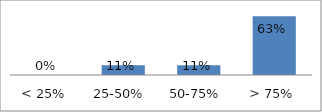
| Category | Series 0 |
|---|---|
| < 25%  | 0 |
| 25-50%  | 0.105 |
| 50-75%  | 0.105 |
| > 75% | 0.632 |